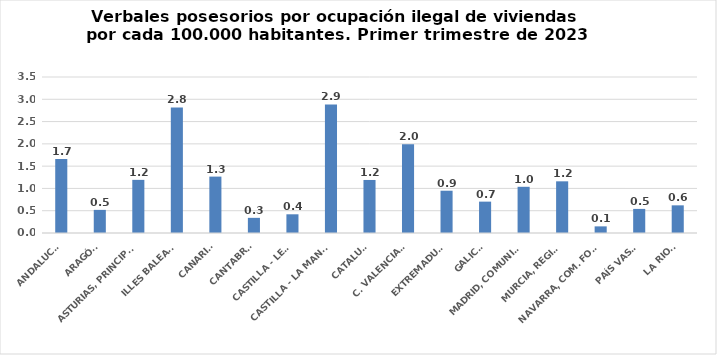
| Category | Series 0 |
|---|---|
| ANDALUCÍA | 1.658 |
| ARAGÓN | 0.519 |
| ASTURIAS, PRINCIPADO | 1.192 |
| ILLES BALEARS | 2.818 |
| CANARIAS | 1.265 |
| CANTABRIA | 0.34 |
| CASTILLA - LEÓN | 0.42 |
| CASTILLA - LA MANCHA | 2.884 |
| CATALUÑA | 1.19 |
| C. VALENCIANA | 1.993 |
| EXTREMADURA | 0.948 |
| GALICIA | 0.704 |
| MADRID, COMUNIDAD | 1.037 |
| MURCIA, REGIÓN | 1.159 |
| NAVARRA, COM. FORAL | 0.149 |
| PAÍS VASCO | 0.541 |
| LA RIOJA | 0.621 |